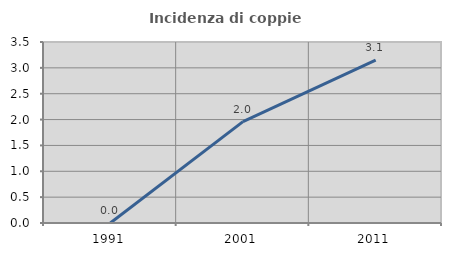
| Category | Incidenza di coppie miste |
|---|---|
| 1991.0 | 0 |
| 2001.0 | 1.961 |
| 2011.0 | 3.15 |